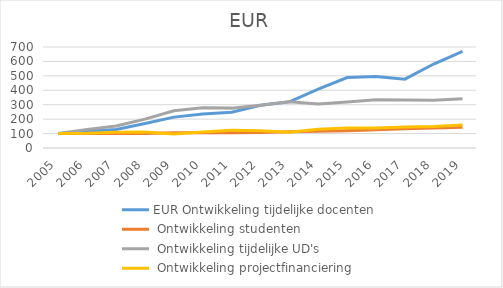
| Category | EUR |
|---|---|
| 2005.0 | 100 |
| 2006.0 | 102.5 |
| 2007.0 | 110 |
| 2008.0 | 110.703 |
| 2009.0 | 96.875 |
| 2010.0 | 110.781 |
| 2011.0 | 122.5 |
| 2012.0 | 119.453 |
| 2013.0 | 109.453 |
| 2014.0 | 130.547 |
| 2015.0 | 138.906 |
| 2016.0 | 138.281 |
| 2017.0 | 146.016 |
| 2018.0 | 149.688 |
| 2019.0 | 160.156 |